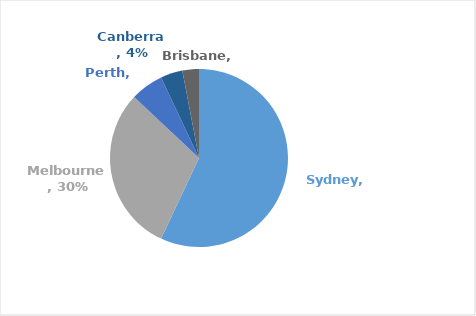
| Category | Series 0 |
|---|---|
| Sydney | 0.57 |
| Melbourne | 0.3 |
| Perth | 0.06 |
| Canberra | 0.04 |
| Brisbane | 0.03 |